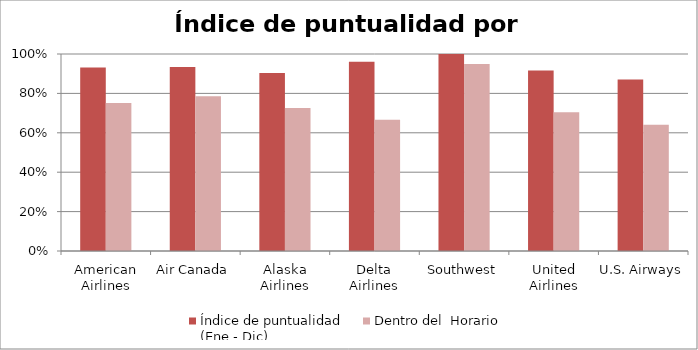
| Category | Índice de puntualidad
(Ene - Dic) | Dentro del  Horario |
|---|---|---|
| American Airlines | 0.932 | 0.751 |
| Air Canada | 0.935 | 0.785 |
| Alaska Airlines | 0.903 | 0.726 |
| Delta Airlines | 0.961 | 0.666 |
| Southwest | 1 | 0.949 |
| United Airlines | 0.916 | 0.704 |
| U.S. Airways | 0.871 | 0.641 |